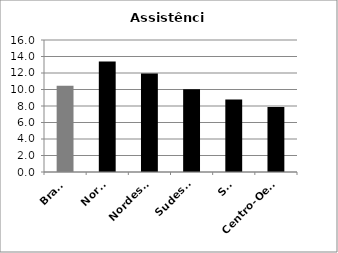
| Category | Assistência |
|---|---|
| Brasil | 10.44 |
| Norte | 13.38 |
| Nordeste | 11.93 |
| Sudeste | 10.03 |
| Sul | 8.8 |
| Centro-Oeste | 7.87 |